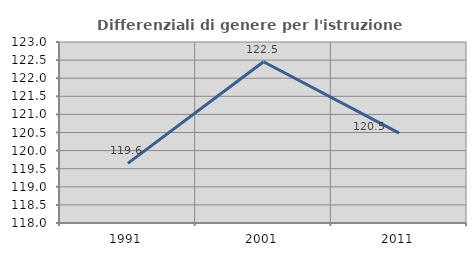
| Category | Differenziali di genere per l'istruzione superiore |
|---|---|
| 1991.0 | 119.648 |
| 2001.0 | 122.455 |
| 2011.0 | 120.481 |